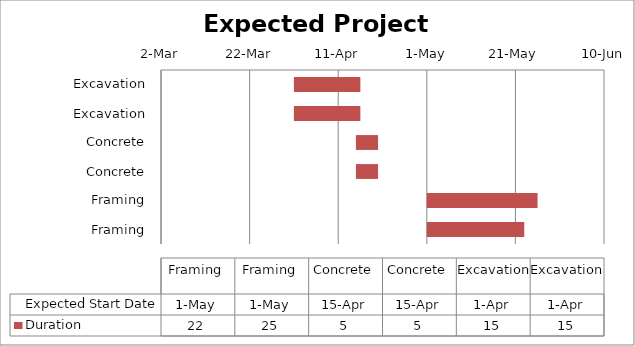
| Category | Expected Start Date | Duration |
|---|---|---|
| Excavation | 2014-04-01 | 15 |
| Excavation | 2014-04-01 | 15 |
| Concrete | 2014-04-15 | 5 |
| Concrete | 2014-04-15 | 5 |
| Framing | 2014-05-01 | 25 |
| Framing | 2014-05-01 | 22 |